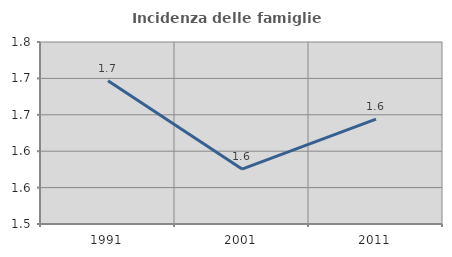
| Category | Incidenza delle famiglie numerose |
|---|---|
| 1991.0 | 1.697 |
| 2001.0 | 1.575 |
| 2011.0 | 1.644 |